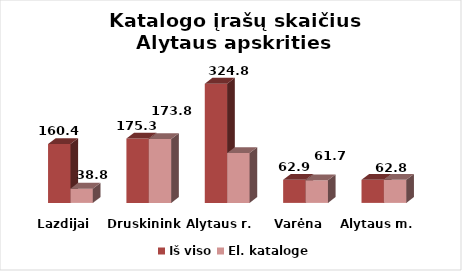
| Category | Iš viso | El. kataloge |
|---|---|---|
| Lazdijai | 160.4 | 38.8 |
| Druskininkai | 175.3 | 173.8 |
| Alytaus r. | 324.8 | 136.1 |
| Varėna | 62.9 | 61.7 |
| Alytaus m. | 62.8 | 62.8 |